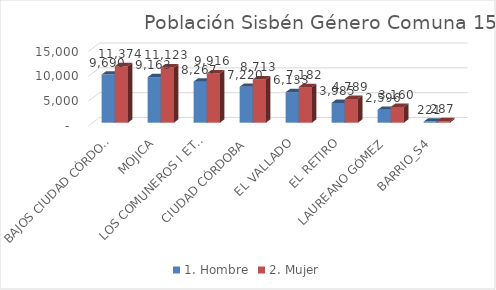
| Category | 1. Hombre | 2. Mujer |
|---|---|---|
| BAJOS CIUDAD CÓRDOBA (MORICHAL) | 9690 | 11374 |
| MOJICA | 9163 | 11123 |
| LOS COMUNEROS I ETAPA | 8267 | 9916 |
| CIUDAD CÓRDOBA | 7220 | 8713 |
| EL VALLADO | 6133 | 7182 |
| EL RETIRO | 3985 | 4789 |
| LAUREANO GÓMEZ | 2596 | 3160 |
| BARRIO_S4 | 221 | 287 |